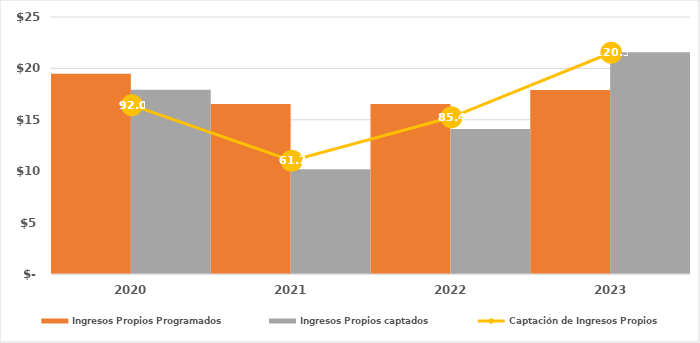
| Category | Ingresos Propios Programados | Ingresos Propios captados |
|---|---|---|
| 2020.0 | 19486.078 | 17917.975 |
| 2021.0 | 16529.292 | 10196.453 |
| 2022.0 | 16529.292 | 14110.939 |
| 2023.0 | 17905.152 | 21581.759 |